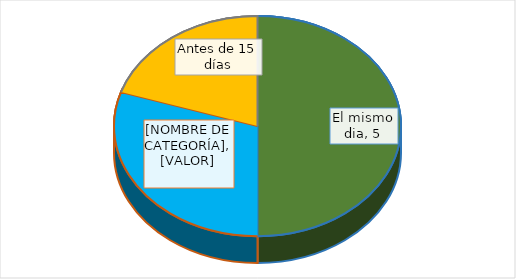
| Category | Series 0 |
|---|---|
| El mismo dia | 5 |
| Antes de 10 días | 3 |
| Antes de 15 días | 2 |